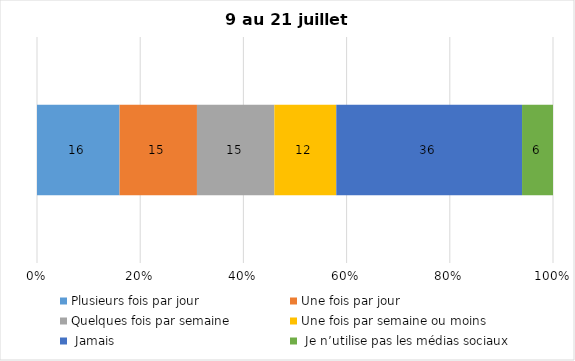
| Category | Plusieurs fois par jour | Une fois par jour | Quelques fois par semaine   | Une fois par semaine ou moins   |  Jamais   |  Je n’utilise pas les médias sociaux |
|---|---|---|---|---|---|---|
| 0 | 16 | 15 | 15 | 12 | 36 | 6 |